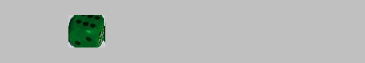
| Category | 1 | 2 | 3 | 4 | 5 | 6 |
|---|---|---|---|---|---|---|
|  | 0 | 0 | 0 | 0 | 0 | 0 |
| 6 | 0 | 0 | 0 | 0 | 0 | 1 |